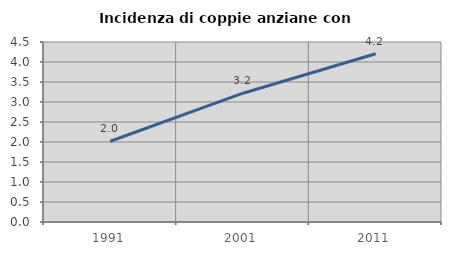
| Category | Incidenza di coppie anziane con figli |
|---|---|
| 1991.0 | 2.018 |
| 2001.0 | 3.22 |
| 2011.0 | 4.205 |